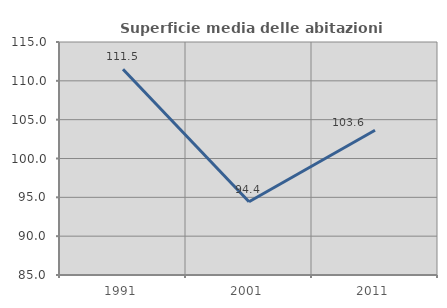
| Category | Superficie media delle abitazioni occupate |
|---|---|
| 1991.0 | 111.503 |
| 2001.0 | 94.427 |
| 2011.0 | 103.637 |